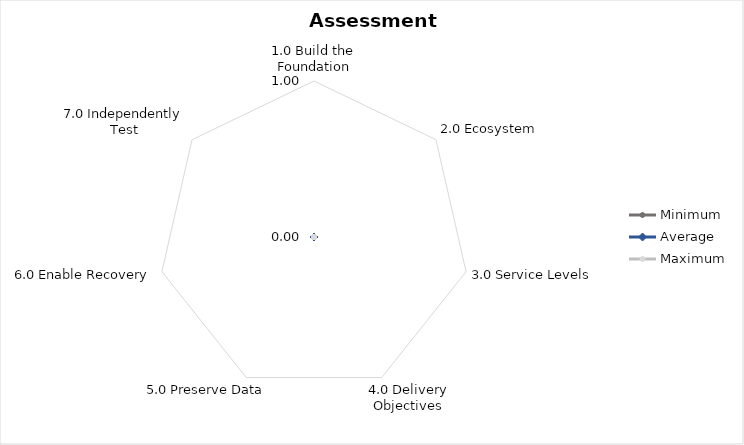
| Category | Minimum | Average | Maximum |
|---|---|---|---|
| 1.0 Build the Foundation | 0 | 0 | 0 |
| 2.0 Ecosystem | 0 | 0 | 0 |
| 3.0 Service Levels | 0 | 0 | 0 |
| 4.0 Delivery Objectives | 0 | 0 | 0 |
| 5.0 Preserve Data | 0 | 0 | 0 |
| 6.0 Enable Recovery | 0 | 0 | 0 |
| 7.0 Independently Test | 0 | 0 | 0 |